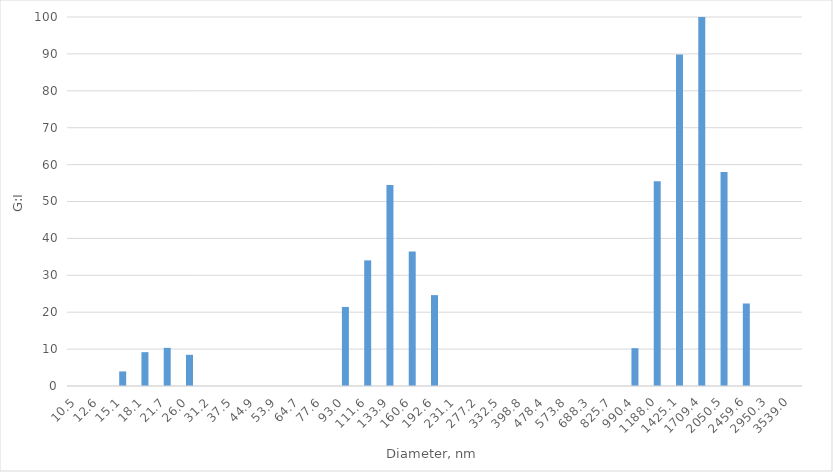
| Category | g-i |
|---|---|
| 10.48556 | 0 |
| 12.57768 | 0 |
| 15.08722 | 3.952 |
| 18.09749 | 9.168 |
| 21.70837 | 10.339 |
| 26.03971 | 8.45 |
| 31.23526 | 0 |
| 37.46745 | 0 |
| 44.94311 | 0 |
| 53.91034 | 0 |
| 64.66675 | 0 |
| 77.56932 | 0 |
| 93.04626 | 21.426 |
| 111.6112 | 34.048 |
| 133.8804 | 54.492 |
| 160.5927 | 36.466 |
| 192.6348 | 24.63 |
| 231.0701 | 0 |
| 277.1741 | 0 |
| 332.477 | 0 |
| 398.8142 | 0 |
| 478.3872 | 0 |
| 573.837 | 0 |
| 688.3312 | 0 |
| 825.6699 | 0 |
| 990.4109 | 10.252 |
| 1188.022 | 55.498 |
| 1425.061 | 89.867 |
| 1709.394 | 100 |
| 2050.46 | 57.973 |
| 2459.576 | 22.365 |
| 2950.32 | 0 |
| 3538.98 | 0 |